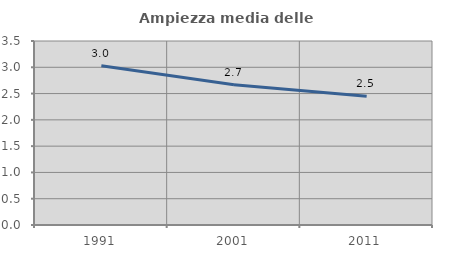
| Category | Ampiezza media delle famiglie |
|---|---|
| 1991.0 | 3.029 |
| 2001.0 | 2.669 |
| 2011.0 | 2.45 |